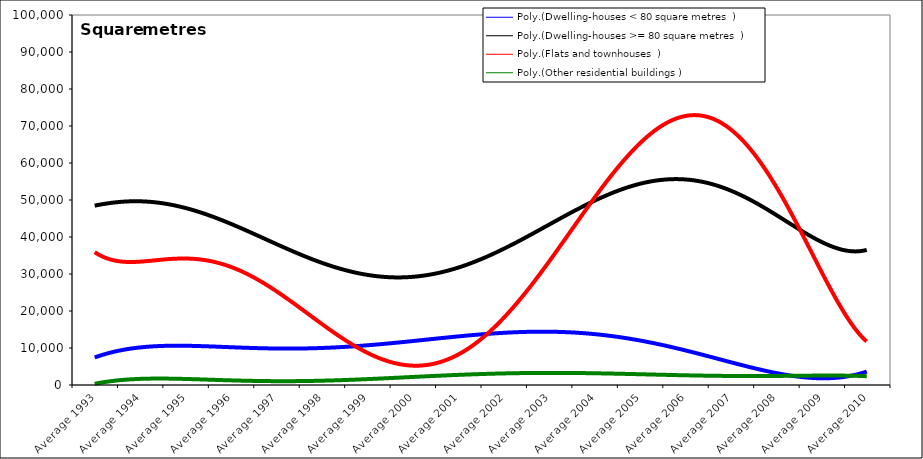
| Category | Dwelling-houses < 80 square metres | Dwelling-houses >= 80 square metres | Flats and townhouses | Other residential buildings |
|---|---|---|---|---|
| Average 1993 | 8362.833 | 49150.667 | 36251.333 | 749 |
| Average 1994 | 8597.75 | 46004 | 30730.25 | 976.667 |
| Average 1995 | 9236.167 | 53843.667 | 40228.083 | 564.083 |
| Average 1996 | 12336.083 | 42175.083 | 27082.333 | 2702.5 |
| Average 1997 | 10219.25 | 33807.833 | 26253.917 | 2061.583 |
| Average 1998 | 10805.667 | 35337.083 | 14789.5 | 1157.583 |
| Average 1999 | 13502.667 | 28354.25 | 8151 | 568.25 |
| Average 2000 | 8646.667 | 33005.417 | 9747 | 1034.333 |
| Average 2001 | 8365.917 | 29737.917 | 10102.917 | 1691.667 |
| Average 2002 | 7953.167 | 36527.083 | 15495.667 | 5879.333 |
| Average 2003 | 29804.667 | 43954.917 | 29153.917 | 2207.167 |
| Average 2004 | 13668.167 | 50620.5 | 43213.25 | 5505.417 |
| Average 2005 | 9015.167 | 51747.583 | 86738.583 | 853.833 |
| Average 2006 | 5352.833 | 56357.083 | 62931.5 | 2518.083 |
| Average 2007 | 5147.25 | 51162.917 | 62257.333 | 2044.333 |
| Average 2008 | 5934.583 | 51678.5 | 61256.083 | 2785.167 |
| Average 2009 | 2800.333 | 33403.75 | 27874.833 | 3131.667 |
| Average 2010 | 2752.875 | 37984.125 | 11922.875 | 2045.5 |